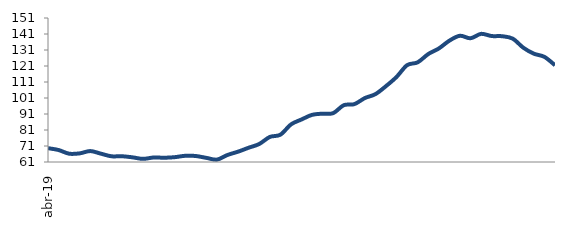
| Category | Series 0 |
|---|---|
| 2019-04-01 | 69.635 |
| 2019-05-01 | 68.49 |
| 2019-06-01 | 66.189 |
| 2019-07-01 | 66.392 |
| 2019-08-01 | 67.837 |
| 2019-09-01 | 66.22 |
| 2019-10-01 | 64.573 |
| 2019-11-01 | 64.608 |
| 2019-12-01 | 63.908 |
| 2020-01-01 | 62.959 |
| 2020-02-01 | 63.811 |
| 2020-03-01 | 63.665 |
| 2020-04-01 | 64.013 |
| 2020-05-01 | 64.885 |
| 2020-06-01 | 64.73 |
| 2020-07-01 | 63.568 |
| 2020-08-01 | 62.507 |
| 2020-09-01 | 65.409 |
| 2020-10-01 | 67.466 |
| 2020-11-01 | 69.929 |
| 2020-12-01 | 72.262 |
| 2021-01-01 | 76.667 |
| 2021-02-01 | 78.05 |
| 2021-03-01 | 84.474 |
| 2021-04-01 | 87.564 |
| 2021-05-01 | 90.47 |
| 2021-06-01 | 91.204 |
| 2021-07-01 | 91.538 |
| 2021-08-01 | 96.497 |
| 2021-09-01 | 97.152 |
| 2021-10-01 | 100.957 |
| 2021-11-01 | 103.422 |
| 2021-12-01 | 108.432 |
| 2022-01-01 | 114.175 |
| 2022-02-01 | 121.528 |
| 2022-03-01 | 123.298 |
| 2022-04-01 | 128.467 |
| 2022-05-01 | 131.948 |
| 2022-06-01 | 136.827 |
| 2022-07-01 | 139.894 |
| 2022-08-01 | 138.341 |
| 2022-09-01 | 141.078 |
| 2022-10-01 | 139.73 |
| 2022-11-01 | 139.602 |
| 2022-12-01 | 138.086 |
| 2023-01-01 | 132.43 |
| 2023-02-01 | 128.69 |
| 2023-03-01 | 126.696 |
| 2023-04-01 | 121.465 |